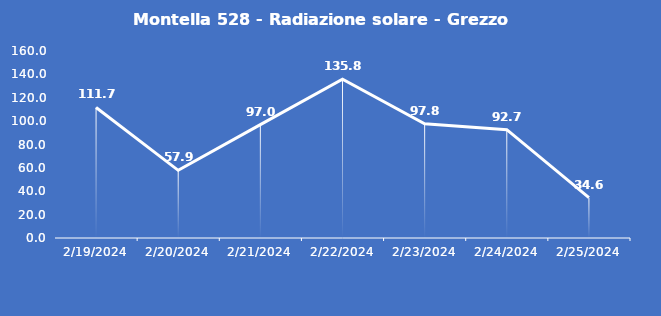
| Category | Montella 528 - Radiazione solare - Grezzo (W/m2) |
|---|---|
| 2/19/24 | 111.7 |
| 2/20/24 | 57.9 |
| 2/21/24 | 97 |
| 2/22/24 | 135.8 |
| 2/23/24 | 97.8 |
| 2/24/24 | 92.7 |
| 2/25/24 | 34.6 |